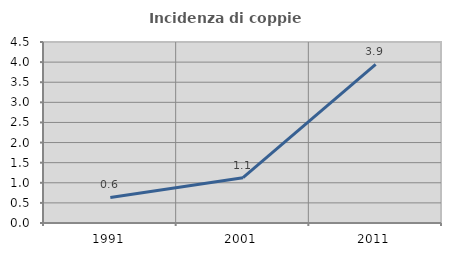
| Category | Incidenza di coppie miste |
|---|---|
| 1991.0 | 0.634 |
| 2001.0 | 1.126 |
| 2011.0 | 3.944 |